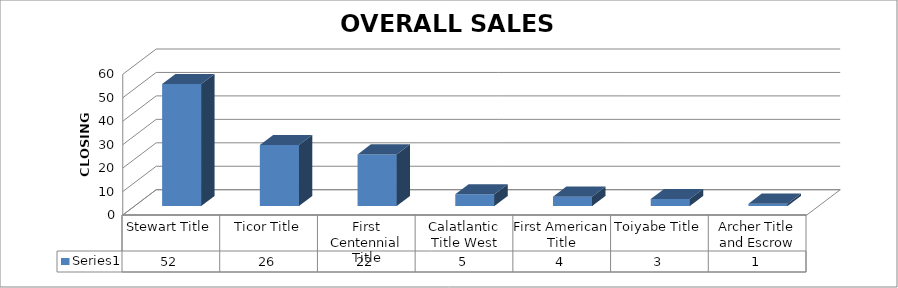
| Category | Series 0 |
|---|---|
| Stewart Title | 52 |
| Ticor Title | 26 |
| First Centennial Title | 22 |
| Calatlantic Title West | 5 |
| First American Title | 4 |
| Toiyabe Title | 3 |
| Archer Title and Escrow | 1 |